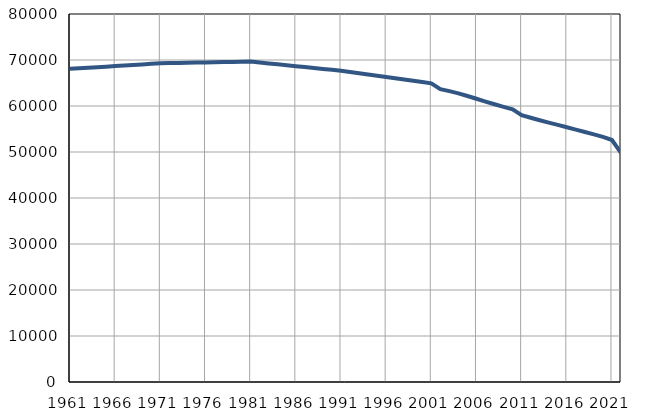
| Category | Population
size |
|---|---|
| 1961.0 | 68073 |
| 1962.0 | 68194 |
| 1963.0 | 68315 |
| 1964.0 | 68437 |
| 1965.0 | 68558 |
| 1966.0 | 68679 |
| 1967.0 | 68800 |
| 1968.0 | 68921 |
| 1969.0 | 69043 |
| 1970.0 | 69164 |
| 1971.0 | 69285 |
| 1972.0 | 69322 |
| 1973.0 | 69358 |
| 1974.0 | 69395 |
| 1975.0 | 69432 |
| 1976.0 | 69468 |
| 1977.0 | 69506 |
| 1978.0 | 69543 |
| 1979.0 | 69579 |
| 1980.0 | 69616 |
| 1981.0 | 69653 |
| 1982.0 | 69454 |
| 1983.0 | 69254 |
| 1984.0 | 69055 |
| 1985.0 | 68855 |
| 1986.0 | 68656 |
| 1987.0 | 68455 |
| 1988.0 | 68256 |
| 1989.0 | 68057 |
| 1990.0 | 67857 |
| 1991.0 | 67658 |
| 1992.0 | 67384 |
| 1993.0 | 67111 |
| 1994.0 | 66837 |
| 1995.0 | 66563 |
| 1996.0 | 66290 |
| 1997.0 | 66017 |
| 1998.0 | 65743 |
| 1999.0 | 65469 |
| 2000.0 | 65195 |
| 2001.0 | 64922 |
| 2002.0 | 63679 |
| 2003.0 | 63229 |
| 2004.0 | 62735 |
| 2005.0 | 62174 |
| 2006.0 | 61578 |
| 2007.0 | 60966 |
| 2008.0 | 60376 |
| 2009.0 | 59825 |
| 2010.0 | 59263 |
| 2011.0 | 57997 |
| 2012.0 | 57440 |
| 2013.0 | 56903 |
| 2014.0 | 56396 |
| 2015.0 | 55885 |
| 2016.0 | 55381 |
| 2017.0 | 54873 |
| 2018.0 | 54342 |
| 2019.0 | 53824 |
| 2020.0 | 53281 |
| 2021.0 | 52602 |
| 2022.0 | 49792 |